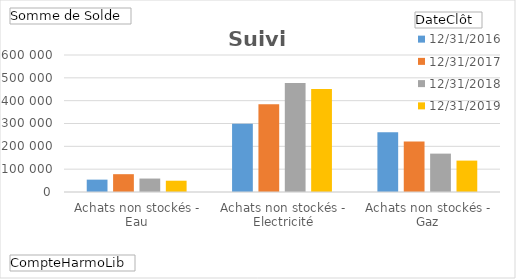
| Category | 31/12/2016 | 31/12/2017 | 31/12/2018 | 31/12/2019 |
|---|---|---|---|---|
| Achats non stockés - Eau | 54147.2 | 78015.06 | 58909.7 | 49435.06 |
| Achats non stockés - Electricité | 298758.58 | 383938.29 | 477581.06 | 451150.87 |
| Achats non stockés - Gaz | 261403.23 | 221344.85 | 168085.18 | 137504.69 |